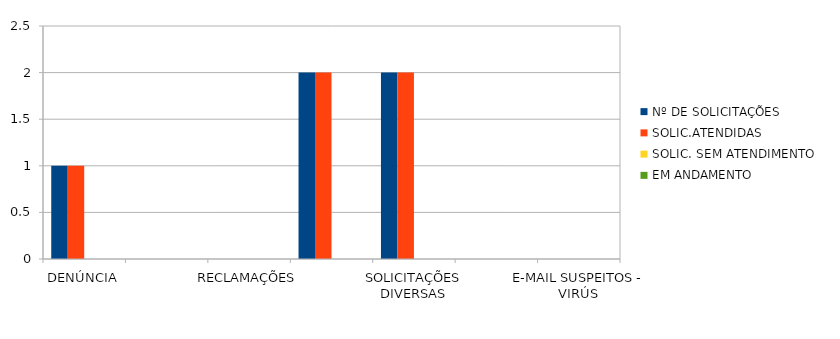
| Category | Nº DE SOLICITAÇÕES | SOLIC.ATENDIDAS | SOLIC. SEM ATENDIMENTO | EM ANDAMENTO |
|---|---|---|---|---|
| DENÚNCIA | 1 | 1 | 0 | 0 |
| DÚVIDA | 0 | 0 | 0 | 0 |
| RECLAMAÇÕES | 0 | 0 | 0 | 0 |
| PEDIDO DE ACESSO À INFORMAÇÃO | 2 | 2 | 0 | 0 |
| SOLICITAÇÕES DIVERSAS | 2 | 2 | 0 | 0 |
| SUGESTÃO  | 0 | 0 | 0 | 0 |
| E-MAIL SUSPEITOS - VIRÚS | 0 | 0 | 0 | 0 |